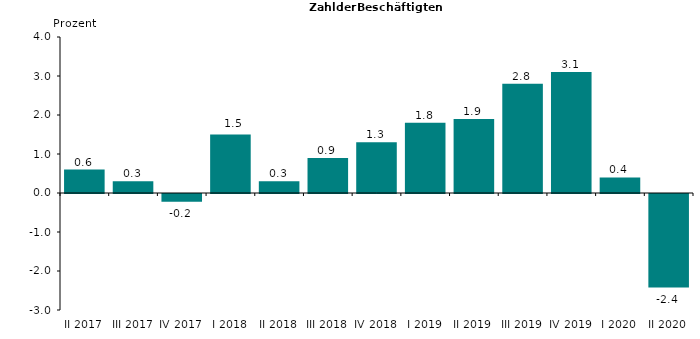
| Category | 0,6 |
|---|---|
| II 2017 | 0.6 |
| III 2017 | 0.3 |
| IV 2017 | -0.2 |
| I 2018 | 1.5 |
| II 2018 | 0.3 |
| III 2018 | 0.9 |
| IV 2018 | 1.3 |
| I 2019 | 1.8 |
| II 2019 | 1.9 |
| III 2019 | 2.8 |
| IV 2019 | 3.1 |
| I 2020 | 0.4 |
| II 2020 | -2.4 |